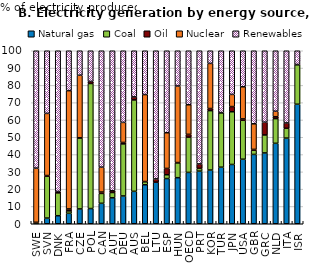
| Category | Natural gas | Coal | Oil | Nuclear | Renewables |
|---|---|---|---|---|---|
| SWE | 0.221 | 0.402 | 0.234 | 31.303 | 67.84 |
| SVN | 3.282 | 24.228 | 0.362 | 35.923 | 36.204 |
| DNK | 4.65 | 13.206 | 0.78 | 0 | 81.364 |
| FRA | 6.047 | 1.397 | 1.117 | 68.375 | 23.063 |
| CZE | 8.574 | 41 | 0.104 | 36.194 | 14.128 |
| POL | 8.792 | 72.28 | 1.167 | 0 | 17.761 |
| CAN | 11.822 | 5.711 | 0.784 | 14.401 | 67.282 |
| AUT | 14.999 | 3.048 | 1.005 | 0 | 80.948 |
| DEU | 16.068 | 30.106 | 0.825 | 11.595 | 41.406 |
| AUS | 18.747 | 52.837 | 1.756 | 0 | 26.661 |
| BEL | 22.545 | 1.76 | 0.11 | 50.255 | 25.33 |
| LTU | 24.05 | 0 | 1.873 | 0 | 74.078 |
| ESP | 26.128 | 2.193 | 3.658 | 20.634 | 47.387 |
| HUN | 26.629 | 8.588 | 0.163 | 44.257 | 20.363 |
| OECD | 29.684 | 20.373 | 1.623 | 17.106 | 31.214 |
| PRT | 30.434 | 1.595 | 2.539 | 0 | 65.431 |
| KOR | 31.044 | 34.33 | 1.24 | 26.066 | 7.319 |
| TUR | 32.712 | 31.434 | 0.102 | 0 | 35.752 |
| JPN | 34.271 | 30.463 | 3.01 | 7.015 | 25.24 |
| USA | 37.303 | 22.506 | 0.798 | 18.568 | 20.825 |
| GBR | 40.068 | 2.417 | 0.497 | 14.803 | 42.215 |
| GRC | 40.938 | 10.396 | 7.39 | 0 | 41.276 |
| NLD | 46.5 | 14.275 | 1.095 | 3.15 | 34.979 |
| ITA | 49.515 | 5.678 | 3.089 | 0 | 41.718 |
| ISR | 69.097 | 22.852 | 0.094 | 0 | 7.957 |